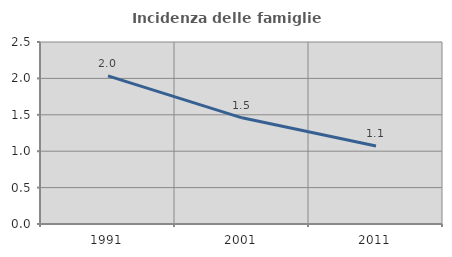
| Category | Incidenza delle famiglie numerose |
|---|---|
| 1991.0 | 2.035 |
| 2001.0 | 1.459 |
| 2011.0 | 1.071 |